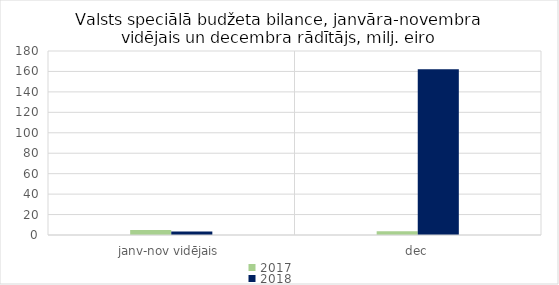
| Category | 2017 | 2018 |
|---|---|---|
| janv-nov vidējais | 4910.719 | 3478.906 |
| dec | 3652.649 | 162256.524 |